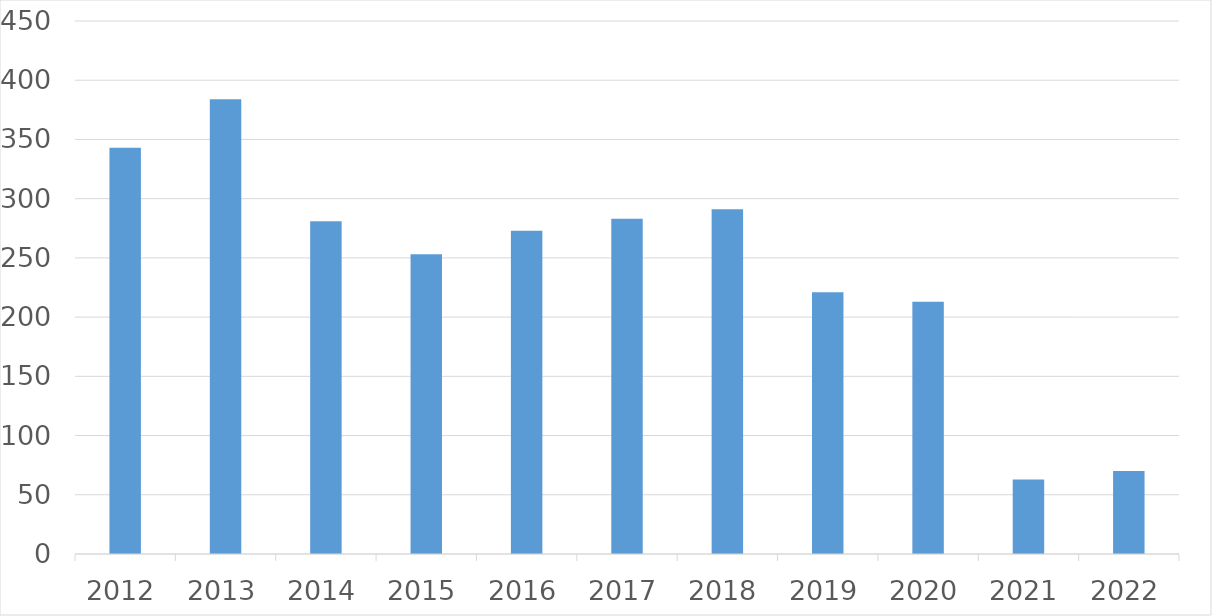
| Category | Series 0 |
|---|---|
| 2012 | 343 |
| 2013 | 384 |
| 2014 | 281 |
| 2015 | 253 |
| 2016 | 273 |
| 2017 | 283 |
| 2018 | 291 |
| 2019 | 221 |
| 2020 | 213 |
| 2021 | 63 |
| 2022 | 70 |